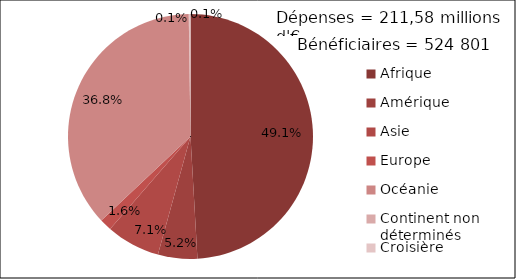
| Category | Montant remboursé |
|---|---|
| Afrique | 103874921.245 |
| Amérique | 10980015.48 |
| Asie | 15039601.483 |
| Europe | 3359958.129 |
| Océanie | 77840099.32 |
| Continent non déterminés | 243051.8 |
| Croisière | 242957.22 |